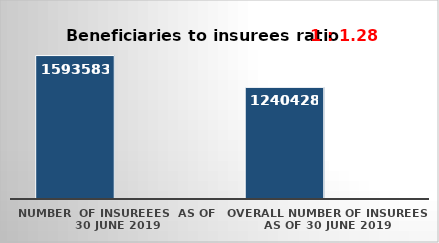
| Category | Series 0 | Series 1 |
|---|---|---|
| NUMBER  of insureees  as of  30 June 2019 | 1593583 |  |
| OVERALL number of insurees as of 30 June 2019 | 1240428 |  |